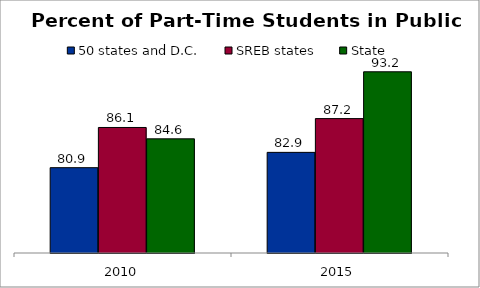
| Category | 50 states and D.C. | SREB states | State |
|---|---|---|---|
| 2010 | 80.939 | 86.092 | 84.637 |
| 2015 | 82.902 | 87.23 | 93.232 |